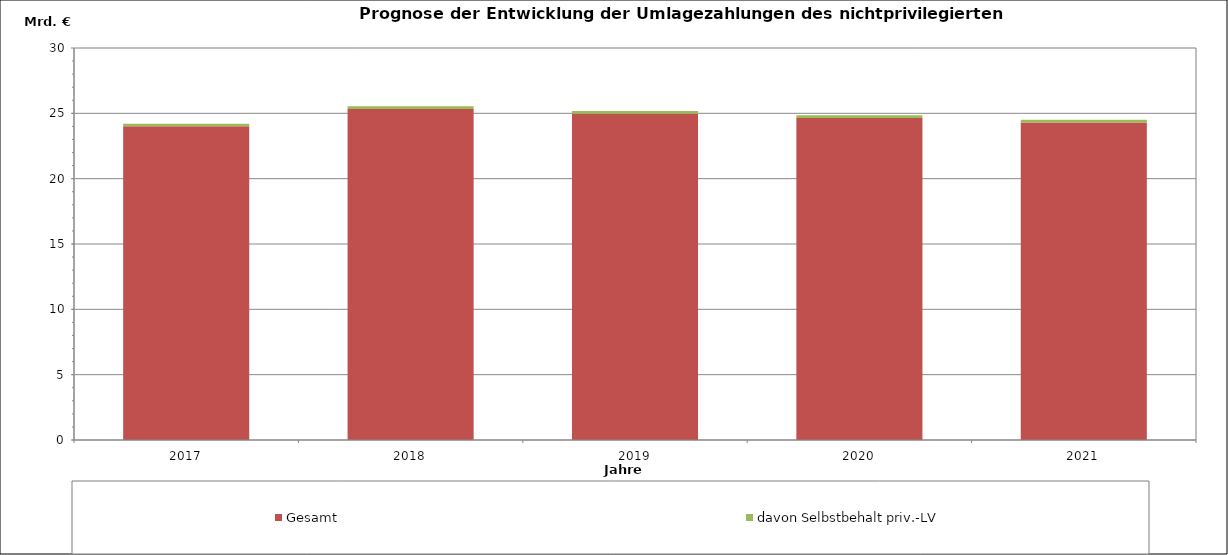
| Category | Gesamt | davon Selbstbehalt priv.-LV |
|---|---|---|
| 2017.0 | 24011.059 | 185.5 |
| 2018.0 | 25331.557 | 209.925 |
| 2019.0 | 24972.377 | 215.175 |
| 2020.0 | 24634.639 | 216.075 |
| 2021.0 | 24299.375 | 216.975 |